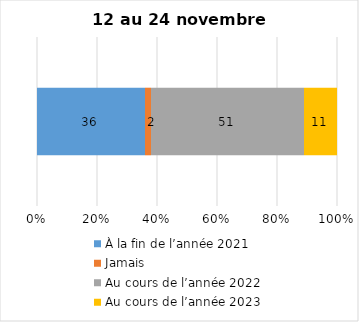
| Category | À la fin de l’année 2021 | Jamais | Au cours de l’année 2022 | Au cours de l’année 2023 |
|---|---|---|---|---|
| 0 | 36 | 2 | 51 | 11 |